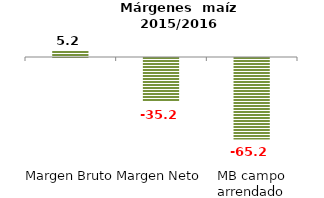
| Category | Series 0 |
|---|---|
| Margen Bruto | 5.211 |
| Margen Neto | -35.209 |
| MB campo arrendado | -65.189 |